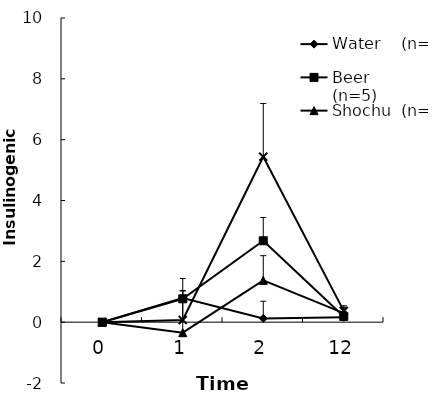
| Category | Water    (n=5) | Beer       (n=5) | Shochu  (n=5) | Sake       (n=5) |
|---|---|---|---|---|
| 0.0 | 0 | 0 | 0 | 0 |
| 1.0 | 0.79 | 0.768 | -0.346 | 0.071 |
| 2.0 | 0.124 | 2.676 | 1.374 | 5.44 |
| 12.0 | 0.163 | 0.189 | 0.298 | 0.371 |